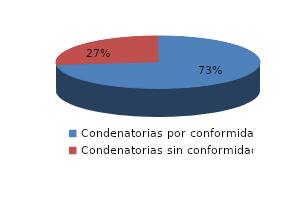
| Category | Series 0 |
|---|---|
| 0 | 755 |
| 1 | 275 |